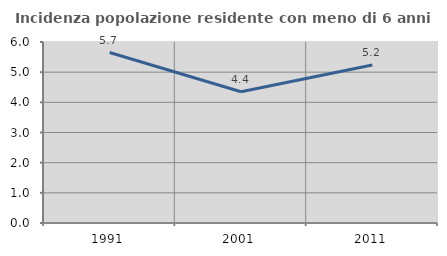
| Category | Incidenza popolazione residente con meno di 6 anni |
|---|---|
| 1991.0 | 5.65 |
| 2001.0 | 4.35 |
| 2011.0 | 5.24 |